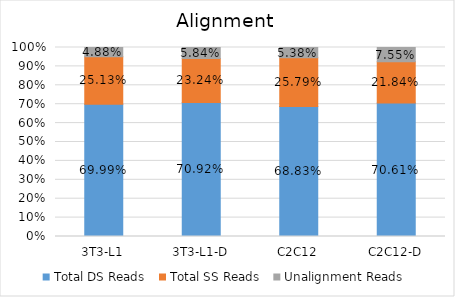
| Category | Total DS Reads | Total SS Reads | Unalignment Reads |
|---|---|---|---|
| 3T3-L1 | 0.7 | 0.251 | 0.049 |
| 3T3-L1-D | 0.709 | 0.232 | 0.058 |
| C2C12 | 0.688 | 0.258 | 0.054 |
| C2C12-D | 0.706 | 0.218 | 0.076 |